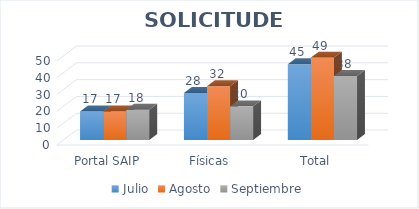
| Category | Julio | Agosto | Septiembre |
|---|---|---|---|
| Portal SAIP | 17 | 17 | 18 |
| Físicas  | 28 | 32 | 20 |
| Total | 45 | 49 | 38 |